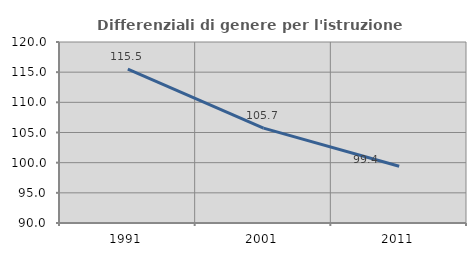
| Category | Differenziali di genere per l'istruzione superiore |
|---|---|
| 1991.0 | 115.493 |
| 2001.0 | 105.719 |
| 2011.0 | 99.4 |